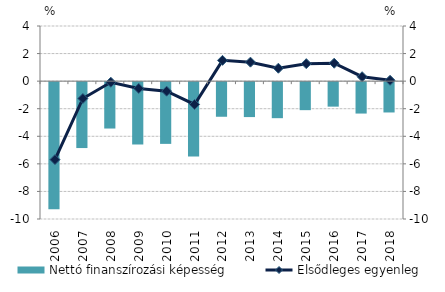
| Category | Nettó finanszírozási képesség |
|---|---|
| 2006.0 | -9.221 |
| 2007.0 | -4.781 |
| 2008.0 | -3.365 |
| 2009.0 | -4.523 |
| 2010.0 | -4.478 |
| 2011.0 | -5.386 |
| 2012.0 | -2.511 |
| 2013.0 | -2.534 |
| 2014.0 | -2.614 |
| 2015.0 | -2.032 |
| 2016.0 | -1.777 |
| 2017.0 | -2.279 |
| 2018.0 | -2.2 |